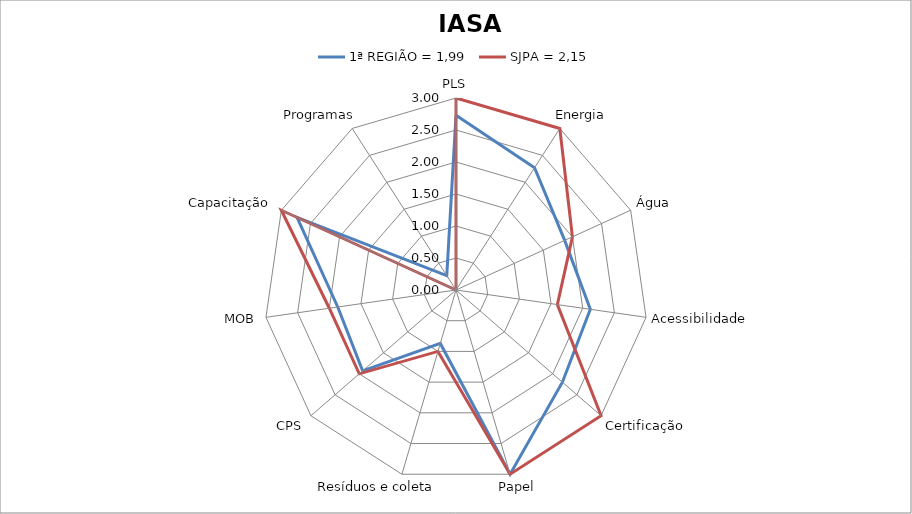
| Category | 1ª REGIÃO = 1,99 | SJPA = 2,15 |
|---|---|---|
| PLS | 2.73 | 3 |
| Energia | 2.27 | 3 |
| Água | 1.867 | 2 |
| Acessibilidade | 2.12 | 1.6 |
| Certificação | 2.2 | 3 |
| Papel | 3 | 3 |
| Resíduos e coleta | 0.87 | 1 |
| CPS | 1.93 | 2 |
| MOB | 1.867 | 2 |
| Capacitação | 2.73 | 3 |
| Programas | 0.267 | 0 |